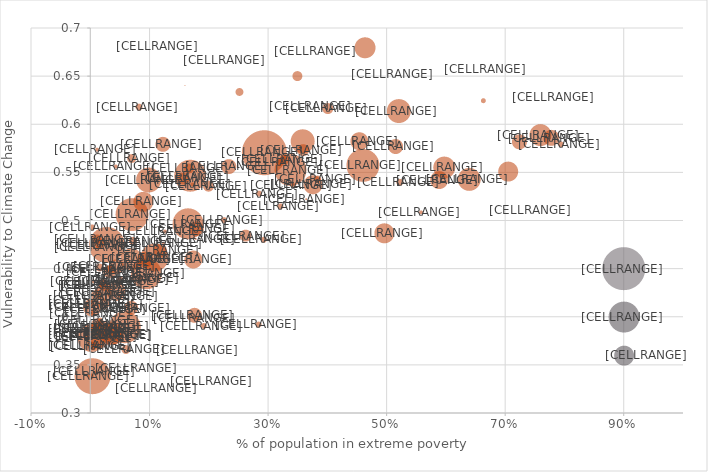
| Category | Vulnerability |
|---|---|
| 0.000213797 | 0.338 |
| 0.0003922 | 0.413 |
| 0.000848097 | 0.417 |
| 0.00104113 | 0.381 |
| 0.00112335 | 0.387 |
| 0.001381 | 0.371 |
| 0.00158205 | 0.383 |
| 0.00201548 | 0.378 |
| 0.00271007 | 0.404 |
| 0.00292686 | 0.41 |
| 0.00301257 | 0.493 |
| 0.00331947 | 0.339 |
| 0.00390954 | 0.37 |
| 0.00495336 | 0.437 |
| 0.00916615 | 0.343 |
| 0.0102041 | 0.423 |
| 0.010383 | 0.389 |
| 0.0106104 | 0.472 |
| 0.0110682 | 0.574 |
| 0.011095 | 0.393 |
| 0.011415 | 0.481 |
| 0.0138207 | 0.38 |
| 0.0151713 | 0.477 |
| 0.0156798 | 0.451 |
| 0.01622 | 0.397 |
| 0.0178757 | 0.382 |
| 0.0185433 | 0.389 |
| 0.0189114 | 0.433 |
| 0.0206936 | 0.436 |
| 0.021447 | 0.426 |
| 0.0224053 | 0.414 |
| 0.0236856 | 0.433 |
| 0.0277545 | 0.475 |
| 0.0280501 | 0.408 |
| 0.0322162 | 0.45 |
| 0.0324109 | 0.447 |
| 0.0325604 | 0.39 |
| 0.0366262 | 0.382 |
| 0.0382797 | 0.381 |
| 0.0427912 | 0.556 |
| 0.0432491 | 0.426 |
| 0.043747 | 0.452 |
| 0.0490659 | 0.422 |
| 0.0503619 | 0.438 |
| 0.0574268 | 0.39 |
| 0.0600573 | 0.366 |
| 0.0678574 | 0.439 |
| 0.0685767 | 0.46 |
| 0.068767 | 0.409 |
| 0.0690812 | 0.565 |
| 0.0700539 | 0.506 |
| 0.0716166 | 0.479 |
| 0.0809664 | 0.347 |
| 0.082205 | 0.618 |
| 0.0833172 | 0.44 |
| 0.0889302 | 0.52 |
| 0.0918302 | 0.46 |
| 0.0938197 | 0.445 |
| 0.0981723 | 0.542 |
| 0.108145 | 0.462 |
| 0.116905 | 0.469 |
| 0.122511 | 0.579 |
| 0.123165 | 0.477 |
| 0.125917 | 0.489 |
| 0.156935 | 0.544 |
| 0.15961 | 0.64 |
| 0.164584 | 0.497 |
| 0.16648 | 0.554 |
| 0.16842 | 0.547 |
| 0.171676 | 0.538 |
| 0.173187 | 0.46 |
| 0.175184 | 0.402 |
| 0.177979 | 0.481 |
| 0.17823 | 0.399 |
| 0.178694 | 0.492 |
| 0.190877 | 0.391 |
| 0.198858 | 0.536 |
| 0.225196 | 0.501 |
| 0.23304 | 0.556 |
| 0.251425 | 0.634 |
| 0.262111 | 0.484 |
| 0.283765 | 0.392 |
| 0.284569 | 0.528 |
| 0.292029 | 0.48 |
| 0.293185 | 0.571 |
| 0.318877 | 0.56 |
| 0.320283 | 0.515 |
| 0.327477 | 0.564 |
| 0.337371 | 0.553 |
| 0.341966 | 0.537 |
| 0.349048 | 0.65 |
| 0.35821 | 0.582 |
| 0.359046 | 0.573 |
| 0.363711 | 0.522 |
| 0.375064 | 0.538 |
| 0.383153 | 0.543 |
| 0.400378 | 0.616 |
| 0.453983 | 0.582 |
| 0.459182 | 0.558 |
| 0.463201 | 0.68 |
| 0.496122 | 0.487 |
| 0.5 | 100 |
| 0.514656 | 0.577 |
| 0.519858 | 0.614 |
| 0.521745 | 0.54 |
| 0.557609 | 0.509 |
| 0.58798 | 0.542 |
| 0.59698 | 0.555 |
| 0.639339 | 0.543 |
| 0.662886 | 0.625 |
| 0.704397 | 0.551 |
| 0.723436 | 0.582 |
| 0.759216 | 0.589 |
| 0.777722 | 0.586 |
| 0.793378 | 0.579 |
| 0.9 | 0.45 |
| 0.9 | 0.4 |
| 0.9 | 0.36 |